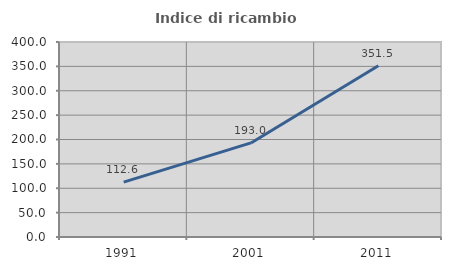
| Category | Indice di ricambio occupazionale  |
|---|---|
| 1991.0 | 112.587 |
| 2001.0 | 193 |
| 2011.0 | 351.471 |